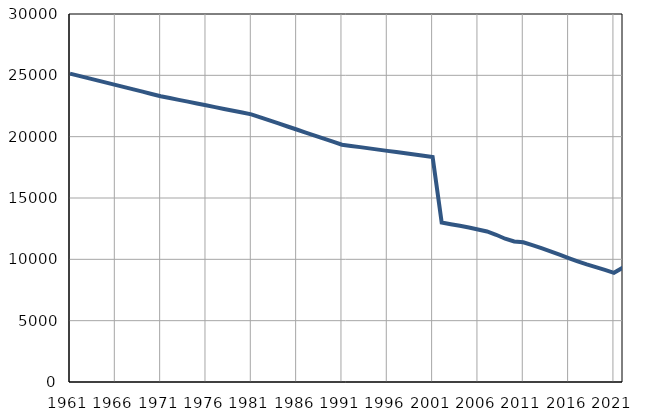
| Category | Број
становника |
|---|---|
| 1961.0 | 25144 |
| 1962.0 | 24959 |
| 1963.0 | 24775 |
| 1964.0 | 24590 |
| 1965.0 | 24406 |
| 1966.0 | 24220 |
| 1967.0 | 24036 |
| 1968.0 | 23852 |
| 1969.0 | 23668 |
| 1970.0 | 23483 |
| 1971.0 | 23298 |
| 1972.0 | 23150 |
| 1973.0 | 23002 |
| 1974.0 | 22854 |
| 1975.0 | 22706 |
| 1976.0 | 22558 |
| 1977.0 | 22411 |
| 1978.0 | 22262 |
| 1979.0 | 22115 |
| 1980.0 | 21966 |
| 1981.0 | 21819 |
| 1982.0 | 21572 |
| 1983.0 | 21325 |
| 1984.0 | 21077 |
| 1985.0 | 20830 |
| 1986.0 | 20583 |
| 1987.0 | 20336 |
| 1988.0 | 20089 |
| 1989.0 | 19841 |
| 1990.0 | 19594 |
| 1991.0 | 19347 |
| 1992.0 | 19246 |
| 1993.0 | 19146 |
| 1994.0 | 19045 |
| 1995.0 | 18944 |
| 1996.0 | 18843 |
| 1997.0 | 18743 |
| 1998.0 | 18642 |
| 1999.0 | 18541 |
| 2000.0 | 18440 |
| 2001.0 | 18340 |
| 2002.0 | 13001 |
| 2003.0 | 12865 |
| 2004.0 | 12736 |
| 2005.0 | 12594 |
| 2006.0 | 12427 |
| 2007.0 | 12270 |
| 2008.0 | 12003 |
| 2009.0 | 11680 |
| 2010.0 | 11457 |
| 2011.0 | 11395 |
| 2012.0 | 11159 |
| 2013.0 | 10906 |
| 2014.0 | 10645 |
| 2015.0 | 10378 |
| 2016.0 | 10097 |
| 2017.0 | 9832 |
| 2018.0 | 9585 |
| 2019.0 | 9359 |
| 2020.0 | 9143 |
| 2021.0 | 8903 |
| 2022.0 | 9335 |